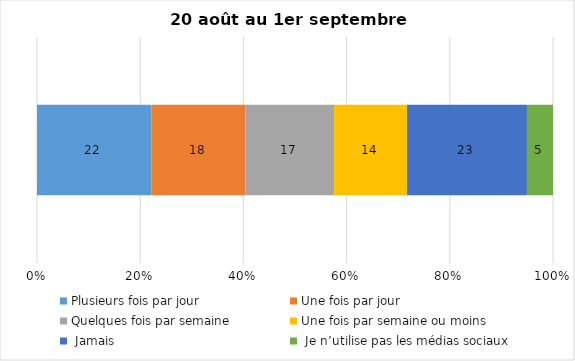
| Category | Plusieurs fois par jour | Une fois par jour | Quelques fois par semaine   | Une fois par semaine ou moins   |  Jamais   |  Je n’utilise pas les médias sociaux |
|---|---|---|---|---|---|---|
| 0 | 22 | 18 | 17 | 14 | 23 | 5 |